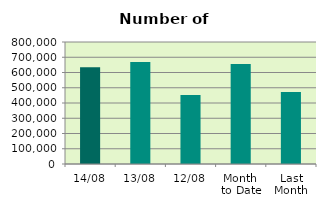
| Category | Series 0 |
|---|---|
| 14/08 | 634870 |
| 13/08 | 669400 |
| 12/08 | 451742 |
| Month 
to Date | 656101 |
| Last
Month | 472929.565 |